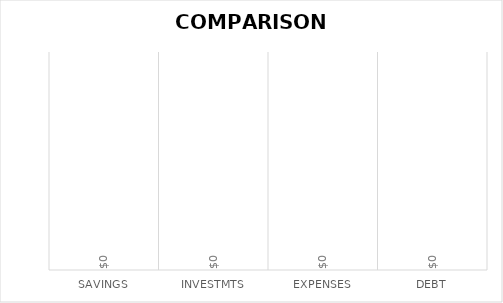
| Category | Series 0 |
|---|---|
| Savings | 0 |
| Investmts | 0 |
| Expenses | 0 |
| Debt | 0 |